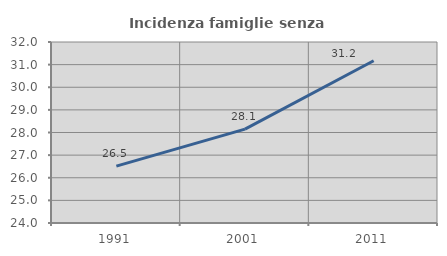
| Category | Incidenza famiglie senza nuclei |
|---|---|
| 1991.0 | 26.516 |
| 2001.0 | 28.149 |
| 2011.0 | 31.172 |